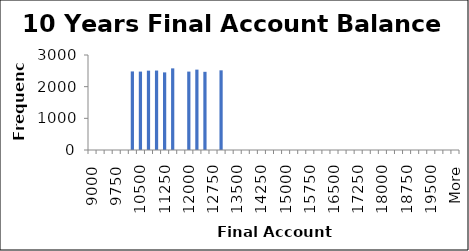
| Category | Frequency |
|---|---|
| 9000.0 | 0 |
| 9250.0 | 0 |
| 9500.0 | 0 |
| 9750.0 | 0 |
| 10000.0 | 0 |
| 10250.0 | 2481 |
| 10500.0 | 2476 |
| 10750.0 | 2506 |
| 11000.0 | 2509 |
| 11250.0 | 2451 |
| 11500.0 | 2578 |
| 11750.0 | 0 |
| 12000.0 | 2476 |
| 12250.0 | 2538 |
| 12500.0 | 2469 |
| 12750.0 | 0 |
| 13000.0 | 2516 |
| 13250.0 | 0 |
| 13500.0 | 0 |
| 13750.0 | 0 |
| 14000.0 | 0 |
| 14250.0 | 0 |
| 14500.0 | 0 |
| 14750.0 | 0 |
| 15000.0 | 0 |
| 15250.0 | 0 |
| 15500.0 | 0 |
| 15750.0 | 0 |
| 16000.0 | 0 |
| 16250.0 | 0 |
| 16500.0 | 0 |
| 16750.0 | 0 |
| 17000.0 | 0 |
| 17250.0 | 0 |
| 17500.0 | 0 |
| 17750.0 | 0 |
| 18000.0 | 0 |
| 18250.0 | 0 |
| 18500.0 | 0 |
| 18750.0 | 0 |
| 19000.0 | 0 |
| 19250.0 | 0 |
| 19500.0 | 0 |
| 19750.0 | 0 |
| 20000.0 | 0 |
| More | 0 |